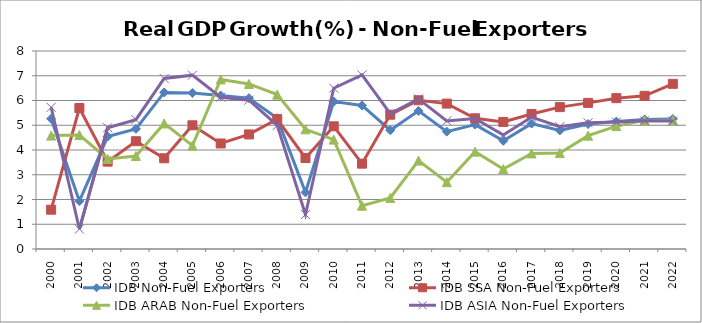
| Category | IDB Non-Fuel Exporters | IDB SSA Non-Fuel Exporters | IDB ARAB Non-Fuel Exporters | IDB ASIA Non-Fuel Exporters |
|---|---|---|---|---|
| 2000.0 | 5.263 | 1.588 | 4.581 | 5.723 |
| 2001.0 | 1.934 | 5.696 | 4.604 | 0.807 |
| 2002.0 | 4.542 | 3.529 | 3.637 | 4.901 |
| 2003.0 | 4.853 | 4.356 | 3.758 | 5.228 |
| 2004.0 | 6.328 | 3.666 | 5.073 | 6.889 |
| 2005.0 | 6.305 | 4.998 | 4.175 | 7.023 |
| 2006.0 | 6.203 | 4.264 | 6.851 | 6.134 |
| 2007.0 | 6.095 | 4.629 | 6.671 | 6.014 |
| 2008.0 | 5.283 | 5.248 | 6.237 | 4.994 |
| 2009.0 | 2.287 | 3.677 | 4.836 | 1.392 |
| 2010.0 | 5.957 | 4.958 | 4.42 | 6.497 |
| 2011.0 | 5.798 | 3.449 | 1.75 | 7.034 |
| 2012.0 | 4.799 | 5.426 | 2.064 | 5.471 |
| 2013.0 | 5.581 | 6.011 | 3.574 | 6.064 |
| 2014.0 | 4.742 | 5.875 | 2.7 | 5.176 |
| 2015.0 | 5.025 | 5.281 | 3.934 | 5.276 |
| 2016.0 | 4.374 | 5.133 | 3.231 | 4.602 |
| 2017.0 | 5.067 | 5.457 | 3.861 | 5.329 |
| 2018.0 | 4.79 | 5.733 | 3.875 | 4.944 |
| 2019.0 | 5.048 | 5.904 | 4.579 | 5.102 |
| 2020.0 | 5.148 | 6.095 | 4.966 | 5.128 |
| 2021.0 | 5.234 | 6.189 | 5.197 | 5.179 |
| 2022.0 | 5.253 | 6.674 | 5.203 | 5.167 |